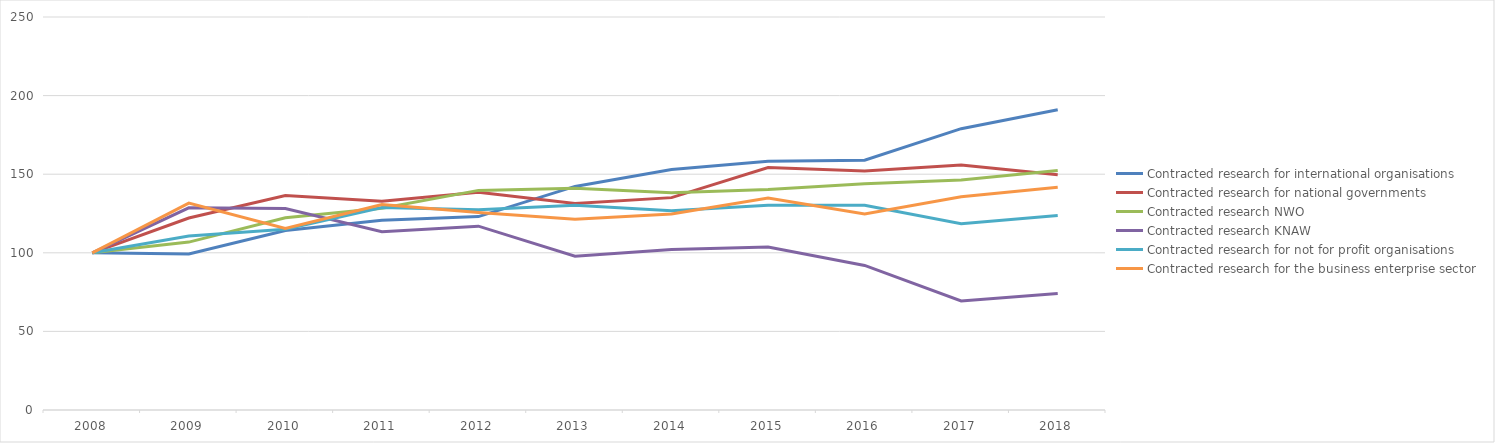
| Category | Contracted research for international organisations | Contracted research for national governments | Contracted research NWO | Contracted research KNAW | Contracted research for not for profit organisations | Contracted research for the business enterprise sector |
|---|---|---|---|---|---|---|
| 2008.0 | 100 | 100 | 100 | 100 | 100 | 100 |
| 2009.0 | 99.189 | 122.144 | 106.817 | 128.598 | 110.731 | 131.63 |
| 2010.0 | 114.149 | 136.372 | 122.232 | 128.13 | 115.008 | 115.482 |
| 2011.0 | 120.732 | 132.753 | 128.402 | 113.399 | 128.759 | 130.673 |
| 2012.0 | 123.039 | 138.484 | 139.707 | 116.942 | 127.459 | 125.593 |
| 2013.0 | 142.22 | 131.403 | 141.031 | 97.83 | 130.305 | 121.413 |
| 2014.0 | 152.96 | 135.095 | 138.266 | 102.038 | 126.706 | 124.712 |
| 2015.0 | 158.279 | 154.264 | 140.232 | 103.727 | 130.325 | 134.846 |
| 2016.0 | 158.86 | 152.108 | 143.909 | 91.981 | 130.207 | 124.638 |
| 2017.0 | 178.967 | 155.848 | 146.24 | 69.322 | 118.493 | 135.598 |
| 2018.0 | 191.019 | 149.662 | 152.304 | 74.183 | 123.704 | 141.741 |